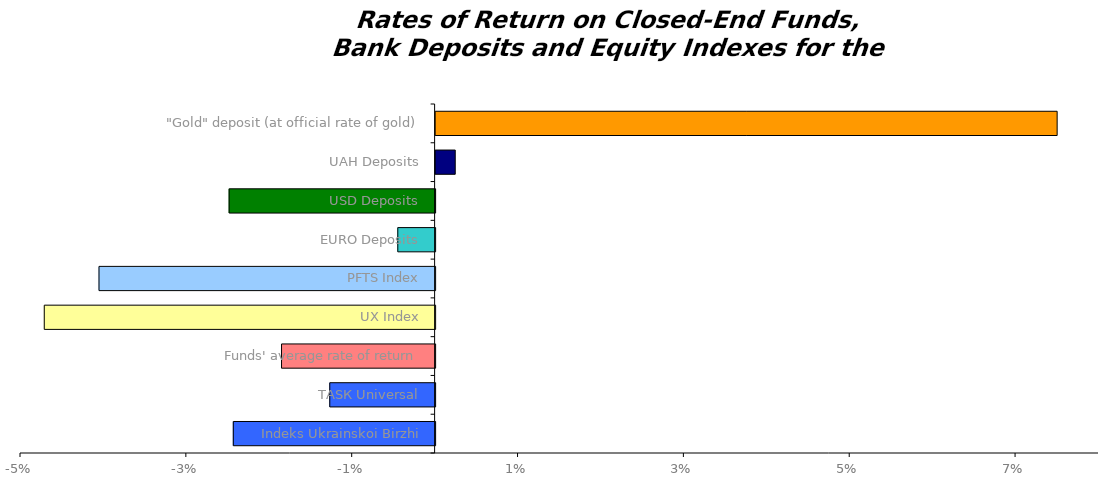
| Category | Series 0 |
|---|---|
| Іndeks Ukrainskoi Birzhi | -0.024 |
| ТАSК Universal | -0.013 |
| Funds' average rate of return | -0.019 |
| UX Index | -0.047 |
| PFTS Index | -0.041 |
| EURO Deposits | -0.005 |
| USD Deposits | -0.025 |
| UAH Deposits | 0.002 |
| "Gold" deposit (at official rate of gold) | 0.075 |